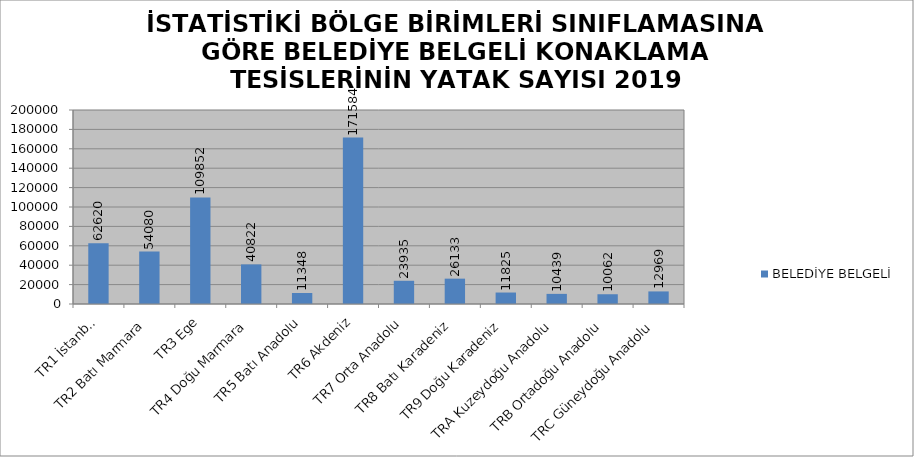
| Category | BELEDİYE BELGELİ |
|---|---|
| TR1 İstanbul | 62620 |
| TR2 Batı Marmara | 54080 |
| TR3 Ege | 109852 |
| TR4 Doğu Marmara | 40822 |
| TR5 Batı Anadolu | 11348 |
| TR6 Akdeniz | 171584 |
| TR7 Orta Anadolu | 23935 |
| TR8 Batı Karadeniz | 26133 |
| TR9 Doğu Karadeniz | 11825 |
| TRA Kuzeydoğu Anadolu | 10439 |
| TRB Ortadoğu Anadolu | 10062 |
| TRC Güneydoğu Anadolu | 12969 |